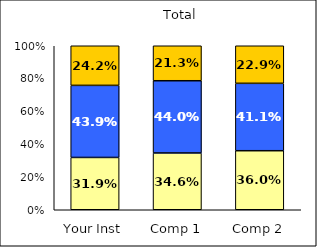
| Category | Low Science Identity | Average Science Identity | High Science Identity |
|---|---|---|---|
| Your Inst | 0.319 | 0.439 | 0.242 |
| Comp 1 | 0.346 | 0.44 | 0.213 |
| Comp 2 | 0.36 | 0.411 | 0.229 |